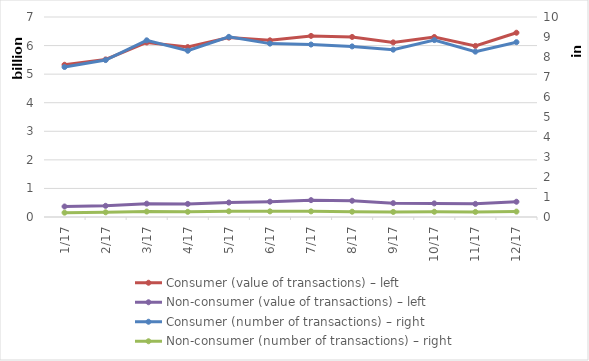
| Category | Consumer (value of transactions) – left | Non-consumer (value of transactions) – left |
|---|---|---|
| 2017-01-01 | 5328305757 | 367507300 |
| 2017-02-01 | 5514428298 | 391222228 |
| 2017-03-01 | 6109050626 | 467467968 |
| 2017-04-01 | 5947363444 | 458334671 |
| 2017-05-01 | 6279287501 | 506845106 |
| 2017-06-01 | 6184001347 | 536271445 |
| 2017-07-01 | 6338700777 | 590146832 |
| 2017-08-01 | 6302293495 | 568602304 |
| 2017-09-01 | 6111140786 | 485351160 |
| 2017-10-01 | 6299859382 | 475738309 |
| 2017-11-01 | 5988278383 | 459634565 |
| 2017-12-01 | 6449820613 | 534029419 |